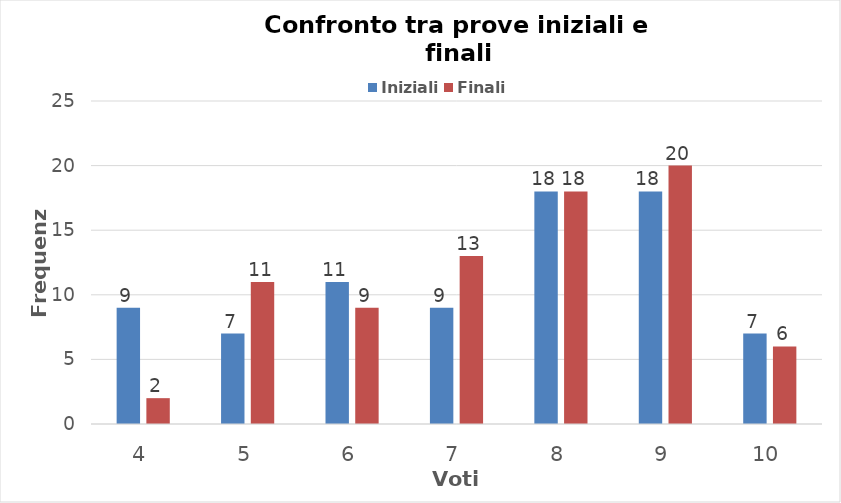
| Category | Iniziali | Finali |
|---|---|---|
| 4.0 | 9 | 2 |
| 5.0 | 7 | 11 |
| 6.0 | 11 | 9 |
| 7.0 | 9 | 13 |
| 8.0 | 18 | 18 |
| 9.0 | 18 | 20 |
| 10.0 | 7 | 6 |